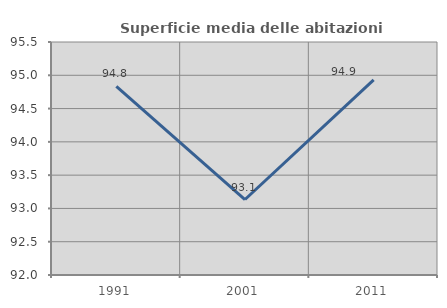
| Category | Superficie media delle abitazioni occupate |
|---|---|
| 1991.0 | 94.833 |
| 2001.0 | 93.134 |
| 2011.0 | 94.93 |